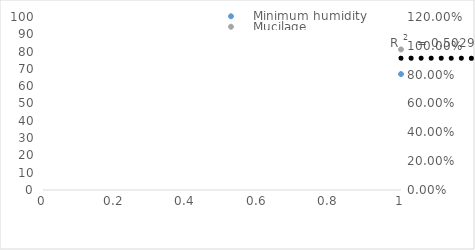
| Category | Minimum humidity  |
|---|---|
| 0 | 67 |
| 1 | 87 |
| 2 | 67 |
| 3 | 91 |
| 4 | 89 |
| 5 | 61 |
| 6 | 72 |
| 7 | 91 |
| 8 | 94 |
| 9 | 68 |
| 10 | 94 |
| 11 | 93 |
| 12 | 75 |
| 13 | 57 |
| 14 | 80 |
| 15 | 89 |
| 16 | 68 |
| 17 | 83 |
| 18 | 80 |
| 19 | 56 |
| 20 | 60 |
| 21 | 80 |
| 22 | 92 |
| 23 | 91 |
| 24 | 73 |
| 25 | 81 |
| 26 | 81 |
| 27 | 57 |
| 28 | 44 |
| 29 | 47 |
| 30 | 84 |
| 31 | 70 |
| 32 | 76 |
| 33 | 66 |
| 34 | 72 |
| 35 | 87 |
| 36 | 61 |
| 37 | 84 |
| 38 | 61 |
| 39 | 77 |
| 40 | 50 |
| 41 | 89 |
| 42 | 70 |
| 43 | 66 |
| 44 | 44 |
| 45 | 79 |
| 46 | 73 |
| 47 | 67 |
| 48 | 81 |
| 49 | 69 |
| 50 | 69 |
| 51 | 72 |
| 52 | 49 |
| 53 | 58 |
| 54 | 84 |
| 55 | 52 |
| 56 | 59 |
| 57 | 85 |
| 58 | 51 |
| 59 | 47 |
| 60 | 64 |
| 61 | 61 |
| 62 | 65 |
| 63 | 81 |
| 64 | 66 |
| 65 | 55 |
| 66 | 78 |
| 67 | 75 |
| 68 | 63 |
| 69 | 71 |
| 70 | 83 |
| 71 | 64 |
| 72 | 92 |
| 73 | 64 |
| 74 | 54 |
| 75 | 92 |
| 76 | 93 |
| 77 | 63 |
| 78 | 68 |
| 79 | 55 |
| 80 | 59 |
| 81 | 84 |
| 82 | 78 |
| 83 | 66 |
| 84 | 71 |
| 85 | 91 |
| 86 | 90 |
| 87 | 62 |
| 88 | 56 |
| 89 | 47 |
| 90 | 62 |
| 91 | 40 |
| 92 | 48 |
| 93 | 80 |
| 94 | 72 |
| 95 | 69 |
| 96 | 51 |
| 97 | 79 |
| 98 | 51 |
| 99 | 67 |
| 100 | 52 |
| 101 | 81 |
| 102 | 86 |
| 103 | 68 |
| 104 | 55 |
| 105 | 50 |
| 106 | 86 |
| 107 | 44 |
| 108 | 51 |
| 109 | 56 |
| 110 | 52 |
| 111 | 71 |
| 112 | 86 |
| 113 | 43 |
| 114 | 55 |
| 115 | 62 |
| 116 | 47 |
| 117 | 45 |
| 118 | 53 |
| 119 | 67 |
| 120 | 48 |
| 121 | 48 |
| 122 | 49 |
| 123 | 59 |
| 124 | 56 |
| 125 | 79 |
| 126 | 36 |
| 127 | 61 |
| 128 | 86 |
| 129 | 66 |
| 130 | 85 |
| 131 | 38 |
| 132 | 46 |
| 133 | 37 |
| 134 | 56 |
| 135 | 53 |
| 136 | 54 |
| 137 | 86 |
| 138 | 77 |
| 139 | 80 |
| 140 | 45 |
| 141 | 61 |
| 142 | 45 |
| 143 | 46 |
| 144 | 49 |
| 145 | 33 |
| 146 | 59 |
| 147 | 55 |
| 148 | 51 |
| 149 | 57 |
| 150 | 71 |
| 151 | 61 |
| 152 | 56 |
| 153 | 54 |
| 154 | 55 |
| 155 | 56 |
| 156 | 62 |
| 157 | 71 |
| 158 | 58 |
| 159 | 52 |
| 160 | 50 |
| 161 | 48 |
| 162 | 43 |
| 163 | 45 |
| 164 | 43 |
| 165 | 44 |
| 166 | 54 |
| 167 | 64 |
| 168 | 55 |
| 169 | 39 |
| 170 | 46 |
| 171 | 42 |
| 172 | 41 |
| 173 | 51 |
| 174 | 54 |
| 175 | 76 |
| 176 | 67 |
| 177 | 63 |
| 178 | 54 |
| 179 | 50 |
| 180 | 50 |
| 181 | 46 |
| 182 | 41 |
| 183 | 47 |
| 184 | 50 |
| 185 | 45 |
| 186 | 49 |
| 187 | 70 |
| 188 | 57 |
| 189 | 51 |
| 190 | 57 |
| 191 | 56 |
| 192 | 54 |
| 193 | 51 |
| 194 | 48 |
| 195 | 51 |
| 196 | 58 |
| 197 | 50 |
| 198 | 51 |
| 199 | 46 |
| 200 | 44 |
| 201 | 47 |
| 202 | 52 |
| 203 | 54 |
| 204 | 67 |
| 205 | 67 |
| 206 | 60 |
| 207 | 50 |
| 208 | 60 |
| 209 | 59 |
| 210 | 53 |
| 211 | 57 |
| 212 | 51 |
| 213 | 58 |
| 214 | 59 |
| 215 | 56 |
| 216 | 55 |
| 217 | 57 |
| 218 | 62 |
| 219 | 56 |
| 220 | 61 |
| 221 | 62 |
| 222 | 68 |
| 223 | 59 |
| 224 | 54 |
| 225 | 56 |
| 226 | 56 |
| 227 | 60 |
| 228 | 50 |
| 229 | 43 |
| 230 | 46 |
| 231 | 69 |
| 232 | 49 |
| 233 | 48 |
| 234 | 52 |
| 235 | 49 |
| 236 | 48 |
| 237 | 51 |
| 238 | 52 |
| 239 | 74 |
| 240 | 82 |
| 241 | 59 |
| 242 | 52 |
| 243 | 55 |
| 244 | 51 |
| 245 | 56 |
| 246 | 48 |
| 247 | 47 |
| 248 | 45 |
| 249 | 36 |
| 250 | 43 |
| 251 | 51 |
| 252 | 36 |
| 253 | 36 |
| 254 | 41 |
| 255 | 43 |
| 256 | 44 |
| 257 | 52 |
| 258 | 58 |
| 259 | 42 |
| 260 | 39 |
| 261 | 31 |
| 262 | 32 |
| 263 | 31 |
| 264 | 32 |
| 265 | 43 |
| 266 | 72 |
| 267 | 40 |
| 268 | 29 |
| 269 | 39 |
| 270 | 42 |
| 271 | 44 |
| 272 | 35 |
| 273 | 45 |
| 274 | 59 |
| 275 | 67 |
| 276 | 50 |
| 277 | 29 |
| 278 | 32 |
| 279 | 37 |
| 280 | 25 |
| 281 | 31 |
| 282 | 31 |
| 283 | 27 |
| 284 | 25 |
| 285 | 30 |
| 286 | 38 |
| 287 | 32 |
| 288 | 21 |
| 289 | 24 |
| 290 | 34 |
| 291 | 29 |
| 292 | 28 |
| 293 | 29 |
| 294 | 30 |
| 295 | 27 |
| 296 | 20 |
| 297 | 30 |
| 298 | 35 |
| 299 | 27 |
| 300 | 33 |
| 301 | 37 |
| 302 | 32 |
| 303 | 30 |
| 304 | 32 |
| 305 | 63 |
| 306 | 43 |
| 307 | 25 |
| 308 | 34 |
| 309 | 37 |
| 310 | 21 |
| 311 | 30 |
| 312 | 28 |
| 313 | 23 |
| 314 | 34 |
| 315 | 35 |
| 316 | 38 |
| 317 | 43 |
| 318 | 31 |
| 319 | 27 |
| 320 | 35 |
| 321 | 24 |
| 322 | 22 |
| 323 | 27 |
| 324 | 25 |
| 325 | 44 |
| 326 | 62 |
| 327 | 66 |
| 328 | 51 |
| 329 | 39 |
| 330 | 36 |
| 331 | 34 |
| 332 | 32 |
| 333 | 41 |
| 334 | 62 |
| 335 | 36 |
| 336 | 40 |
| 337 | 43 |
| 338 | 46 |
| 339 | 55 |
| 340 | 49 |
| 341 | 48 |